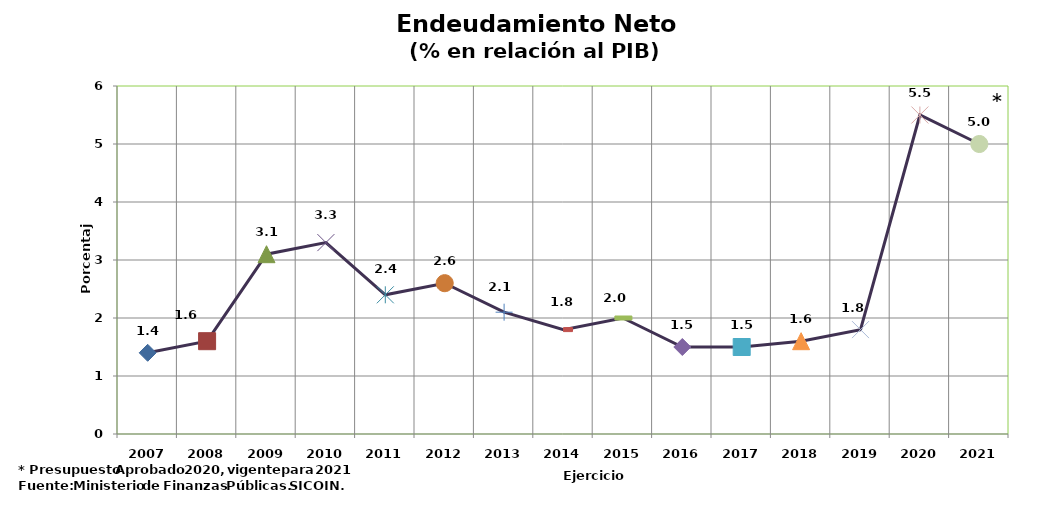
| Category | Series 0 |
|---|---|
| 2007 | 1.4 |
| 2008 | 1.6 |
| 2009 | 3.1 |
| 2010 | 3.3 |
| 2011 | 2.4 |
| 2012 | 2.6 |
| 2013 | 2.1 |
| 2014 | 1.8 |
| 2015 | 2 |
| 2016 | 1.5 |
| 2017 | 1.5 |
| 2018 | 1.6 |
| 2019 | 1.8 |
| 2020 | 5.5 |
| 2021 | 5 |